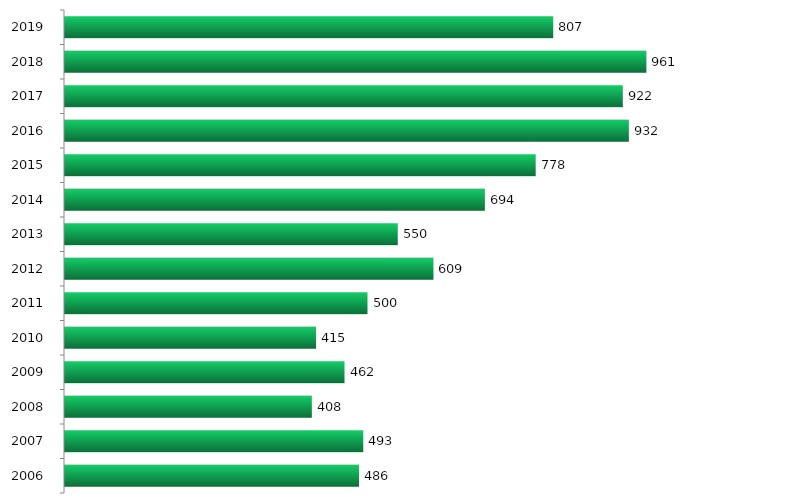
| Category | Series 0 |
|---|---|
| 2006.0 | 486 |
| 2007.0 | 493 |
| 2008.0 | 408 |
| 2009.0 | 462 |
| 2010.0 | 415 |
| 2011.0 | 500 |
| 2012.0 | 609 |
| 2013.0 | 550 |
| 2014.0 | 694 |
| 2015.0 | 778 |
| 2016.0 | 932 |
| 2017.0 | 922 |
| 2018.0 | 961 |
| 2019.0 | 807 |